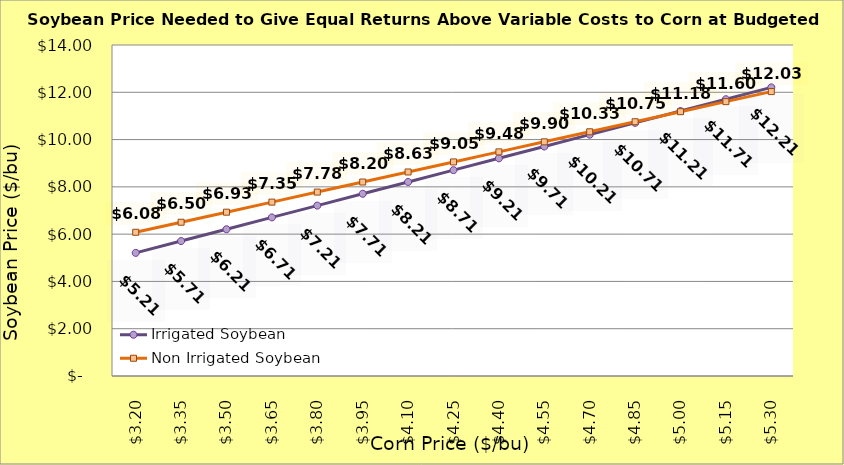
| Category | Irrigated Soybean | Non Irrigated Soybean |
|---|---|---|
| 3.2 | 5.207 | 6.079 |
| 3.35 | 5.707 | 6.504 |
| 3.5 | 6.207 | 6.929 |
| 3.65 | 6.707 | 7.354 |
| 3.8 | 7.207 | 7.779 |
| 3.9499999999999997 | 7.707 | 8.204 |
| 4.1 | 8.207 | 8.629 |
| 4.25 | 8.707 | 9.054 |
| 4.4 | 9.207 | 9.479 |
| 4.550000000000001 | 9.707 | 9.904 |
| 4.700000000000001 | 10.207 | 10.329 |
| 4.850000000000001 | 10.707 | 10.754 |
| 5.000000000000002 | 11.207 | 11.179 |
| 5.150000000000002 | 11.707 | 11.604 |
| 5.3000000000000025 | 12.207 | 12.029 |